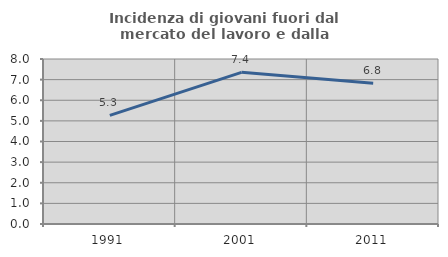
| Category | Incidenza di giovani fuori dal mercato del lavoro e dalla formazione  |
|---|---|
| 1991.0 | 5.263 |
| 2001.0 | 7.353 |
| 2011.0 | 6.823 |